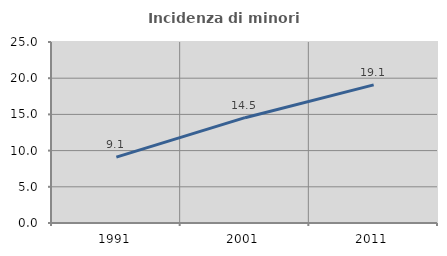
| Category | Incidenza di minori stranieri |
|---|---|
| 1991.0 | 9.091 |
| 2001.0 | 14.545 |
| 2011.0 | 19.084 |